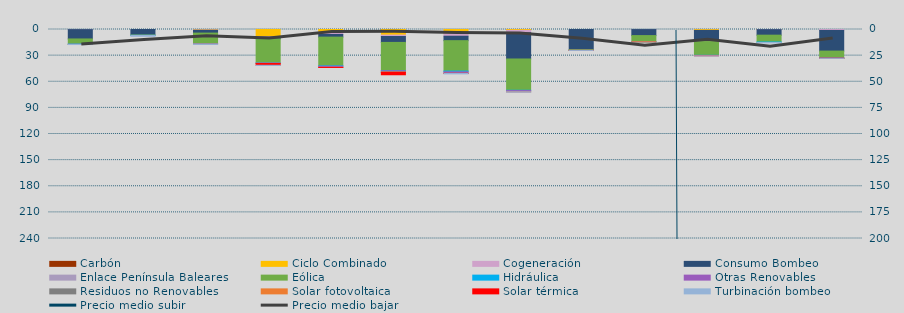
| Category | Carbón | Ciclo Combinado | Cogeneración | Consumo Bombeo | Enlace Península Baleares | Eólica | Hidráulica | Otras Renovables | Residuos no Renovables | Solar fotovoltaica | Solar térmica | Turbinación bombeo |
|---|---|---|---|---|---|---|---|---|---|---|---|---|
| 0 |  | 0 | 132.9 | 10732.4 | 0 | 5808.3 | 350.7 | 98.7 | 0 | 2.1 | 0 | 152.1 |
| 1 |  | 0 | 0 | 6311.1 | 0 | 429.6 | 2 | 0 | 0 | 0 | 0 | 1049.5 |
| 2 |  | 520 | 398.7 | 3208 | 0 | 12396.3 | 41.7 | 256.7 | 0 | 0.8 | 0 | 340.4 |
| 3 |  | 8320.6 | 532.5 | 1797.8 | 0 | 27746.3 | 146.7 | 300.2 | 0 | 250.5 | 1972.6 | 219.1 |
| 4 |  | 3526.6 | 2136.1 | 3089.7 | 0 | 32962.8 | 457 | 1325.6 | 0 | 38.1 | 15 | 0 |
| 5 |  | 6424.4 | 1632 | 6769.5 | 0 | 32546.8 | 161.3 | 1318.2 | 30.1 | 404.6 | 2687.6 | 0 |
| 6 |  | 4734 | 2991.4 | 5082.6 | 0 | 34919.2 | 974.6 | 1593 | 0 | 127.6 | 75.4 | 456.5 |
| 7 |  | 1002.5 | 2760.3 | 30103.8 | 0 | 35894 | 414.2 | 1401.5 | 0 | 44.9 | 0 | 291.7 |
| 8 |  | 0 | 0 | 23016.4 | 0 | 876.3 | 57 | 0 | 0 | 2.3 | 24.4 | 80 |
| 9 |  | 0 | 75.3 | 6919 | 0 | 7092 | 5.4 | 35 | 0 | 9.9 | 0 | 0 |
| 10 |  | 961.7 | 104.4 | 12588.9 | 171.2 | 15813.4 | 165.3 | 58 | 0 | 94.9 | 202.5 | 300 |
| 11 |  | 25 | 116.4 | 6359.7 | 0 | 7846.5 | 596.6 | 0 | 0 | 0 | 0 | 449 |
| 12 |  | 0 | 1089.4 | 23705.1 | 0 | 7599.2 | 452.8 | 116.6 | 75.4 | 17.6 | 85.1 | 49.3 |